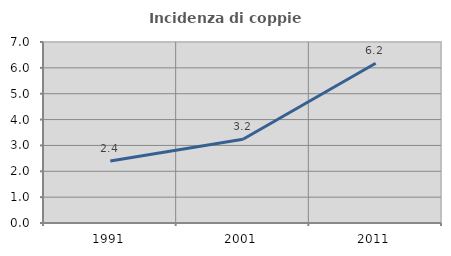
| Category | Incidenza di coppie miste |
|---|---|
| 1991.0 | 2.397 |
| 2001.0 | 3.239 |
| 2011.0 | 6.18 |